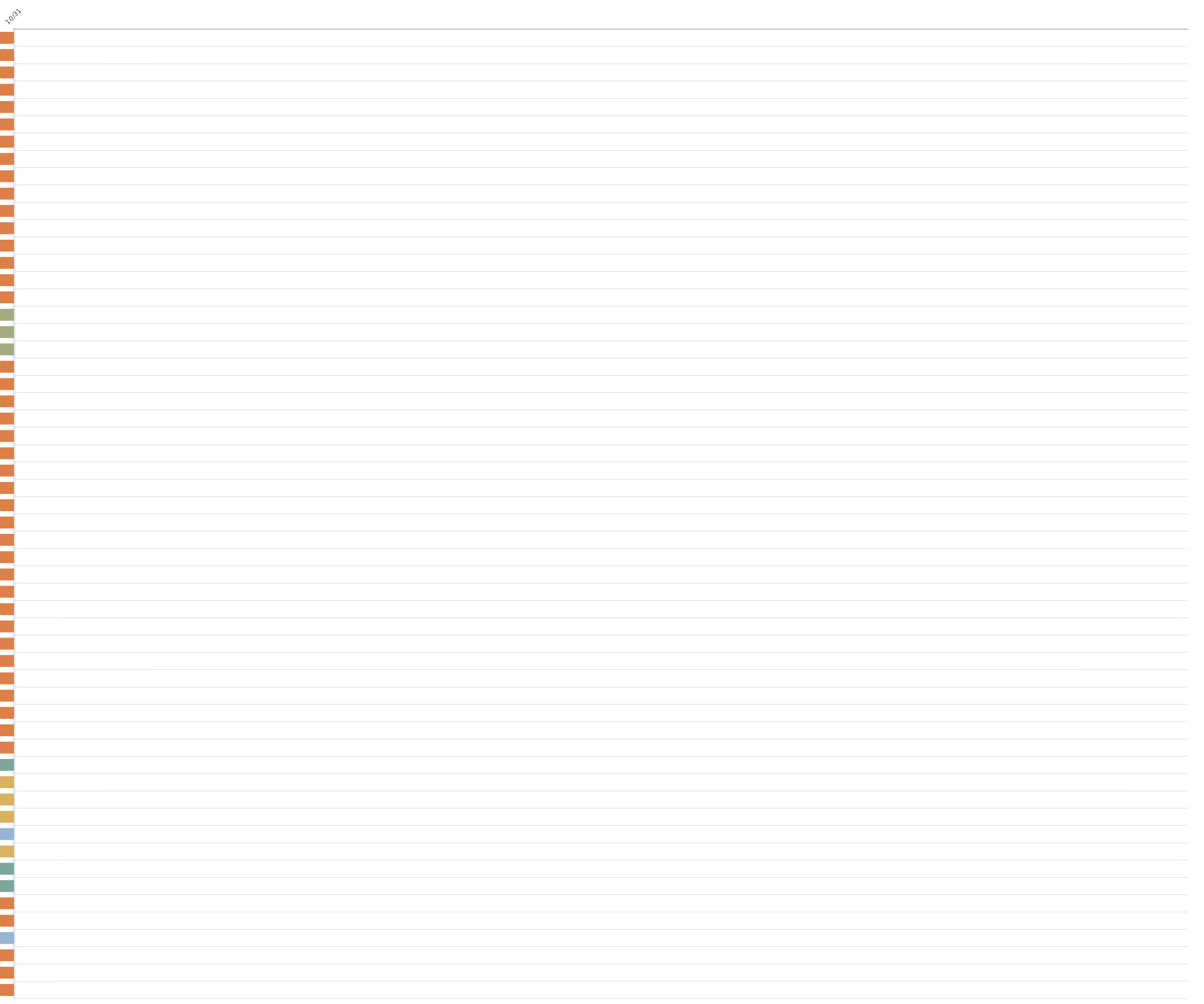
| Category | 1 | DURATION |
|---|---|---|
| 1.0 |  | 1 |
| 2.0 |  | 1 |
| 3.0 |  | 1 |
| 4.0 |  | 1 |
| 5.0 |  | 1 |
| 6.0 |  | 1 |
| 7.0 |  | 1 |
| 8.0 |  | 1 |
| 9.0 |  | 1 |
| 10.0 |  | 1 |
| 11.0 |  | 1 |
| 12.0 |  | 1 |
| 13.0 |  | 1 |
| 14.0 |  | 1 |
| 15.0 |  | 1 |
| 16.0 |  | 1 |
| 17.0 |  | 1 |
| 18.0 |  | 1 |
| 19.0 |  | 1 |
| 20.0 |  | 1 |
| 21.0 |  | 1 |
| 22.0 |  | 1 |
| 23.0 |  | 1 |
| 24.0 |  | 1 |
| 25.0 |  | 1 |
| 26.0 |  | 1 |
| 27.0 |  | 1 |
| 28.0 |  | 1 |
| 29.0 |  | 1 |
| 30.0 |  | 1 |
| 31.0 |  | 1 |
| 32.0 |  | 1 |
| 33.0 |  | 1 |
| 34.0 |  | 1 |
| 35.0 |  | 1 |
| 36.0 |  | 1 |
| 37.0 |  | 1 |
| 38.0 |  | 1 |
| 39.0 |  | 1 |
| 40.0 |  | 1 |
| 41.0 |  | 1 |
| 42.0 |  | 1 |
| 43.0 |  | 1 |
| 44.0 |  | 1 |
| 45.0 |  | 1 |
| 46.0 |  | 1 |
| 47.0 |  | 1 |
| 48.0 |  | 1 |
| 49.0 |  | 1 |
| 50.0 |  | 1 |
| 51.0 |  | 1 |
| 52.0 |  | 1 |
| 53.0 |  | 1 |
| 54.0 |  | 1 |
| 55.0 |  | 1 |
| 56.0 |  | 1 |